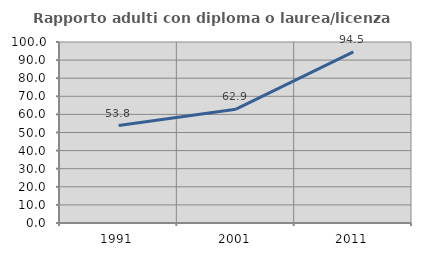
| Category | Rapporto adulti con diploma o laurea/licenza media  |
|---|---|
| 1991.0 | 53.846 |
| 2001.0 | 62.871 |
| 2011.0 | 94.545 |